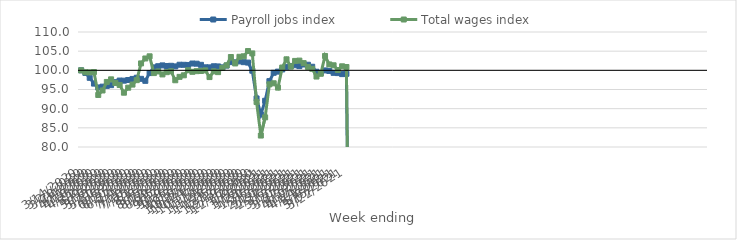
| Category | Payroll jobs index | Total wages index |
|---|---|---|
| 14/03/2020 | 100 | 100 |
| 21/03/2020 | 99.314 | 99.499 |
| 28/03/2020 | 98.047 | 99.464 |
| 04/04/2020 | 96.54 | 99.554 |
| 11/04/2020 | 95.538 | 93.576 |
| 18/04/2020 | 95.745 | 94.744 |
| 25/04/2020 | 95.941 | 96.972 |
| 02/05/2020 | 96.134 | 97.648 |
| 09/05/2020 | 96.914 | 96.704 |
| 16/05/2020 | 97.335 | 96.182 |
| 23/05/2020 | 97.304 | 94.165 |
| 30/05/2020 | 97.478 | 95.469 |
| 06/06/2020 | 97.756 | 96.283 |
| 13/06/2020 | 98.072 | 97.435 |
| 20/06/2020 | 97.782 | 101.803 |
| 27/06/2020 | 97.259 | 103.094 |
| 04/07/2020 | 99.291 | 103.656 |
| 11/07/2020 | 100.772 | 99.281 |
| 18/07/2020 | 101.076 | 99.708 |
| 25/07/2020 | 101.288 | 98.931 |
| 01/08/2020 | 101.132 | 99.518 |
| 08/08/2020 | 101.187 | 99.746 |
| 15/08/2020 | 101.028 | 97.412 |
| 22/08/2020 | 101.457 | 98.294 |
| 29/08/2020 | 101.441 | 98.701 |
| 05/09/2020 | 101.4 | 100.035 |
| 12/09/2020 | 101.776 | 99.617 |
| 19/09/2020 | 101.73 | 99.785 |
| 26/09/2020 | 101.437 | 99.826 |
| 03/10/2020 | 100.791 | 99.995 |
| 10/10/2020 | 100.772 | 98.241 |
| 17/10/2020 | 101.064 | 99.73 |
| 24/10/2020 | 101.02 | 99.53 |
| 31/10/2020 | 100.775 | 100.645 |
| 07/11/2020 | 101.242 | 101.3 |
| 14/11/2020 | 102.138 | 103.476 |
| 21/11/2020 | 102.092 | 101.796 |
| 28/11/2020 | 102.332 | 103.527 |
| 05/12/2020 | 102.129 | 103.664 |
| 12/12/2020 | 102.022 | 105.034 |
| 19/12/2020 | 99.899 | 104.413 |
| 26/12/2020 | 92.676 | 91.726 |
| 02/01/2021 | 88.488 | 82.987 |
| 09/01/2021 | 92.065 | 87.734 |
| 16/01/2021 | 97.181 | 96.352 |
| 23/01/2021 | 99.354 | 96.626 |
| 30/01/2021 | 99.663 | 95.486 |
| 06/02/2021 | 100.233 | 100.731 |
| 13/02/2021 | 100.917 | 102.874 |
| 20/02/2021 | 101.114 | 100.964 |
| 27/02/2021 | 101.332 | 102.459 |
| 06/03/2021 | 101.11 | 102.537 |
| 13/03/2021 | 101.524 | 101.882 |
| 20/03/2021 | 101.458 | 100.887 |
| 27/03/2021 | 100.935 | 100.405 |
| 03/04/2021 | 99.637 | 98.382 |
| 10/04/2021 | 99.3 | 99.1 |
| 17/04/2021 | 99.977 | 103.746 |
| 24/04/2021 | 99.837 | 101.537 |
| 01/05/2021 | 99.346 | 101.316 |
| 08/05/2021 | 99.279 | 100.09 |
| 15/05/2021 | 99.013 | 101.052 |
| 22/05/2021 | 99.098 | 100.869 |